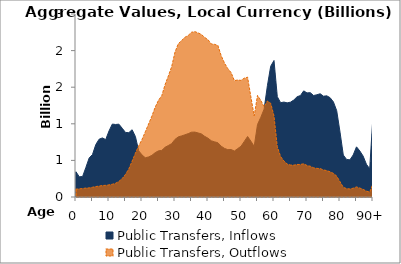
| Category | Public Transfers, Inflows | Public Transfers, Outflows |
|---|---|---|
| 0 | 343.75 | 106.53 |
|  | 275.985 | 111.307 |
| 2 | 280.15 | 115.499 |
| 3 | 404.807 | 122.504 |
| 4 | 533.809 | 124.625 |
| 5 | 580.75 | 133.541 |
| 6 | 716.269 | 142.572 |
| 7 | 789.448 | 149.073 |
| 8 | 807.11 | 156.905 |
| 9 | 784.408 | 159.259 |
| 10 | 901.787 | 165.523 |
| 11 | 996.02 | 173.846 |
| 12 | 990.498 | 187.168 |
| 13 | 994.981 | 212.823 |
| 14 | 939.573 | 251.793 |
| 15 | 881.979 | 309.012 |
| 16 | 878.866 | 382.616 |
| 17 | 918.712 | 489.172 |
| 18 | 826.902 | 597.548 |
| 19 | 630.935 | 699.611 |
| 20 | 574.482 | 785.461 |
| 21 | 536.081 | 890.348 |
| 22 | 547.18 | 997.469 |
| 23 | 569.436 | 1105.337 |
| 24 | 605.675 | 1226.828 |
| 25 | 630.66 | 1322.252 |
| 26 | 636.933 | 1385.184 |
| 27 | 679.573 | 1535.582 |
| 28 | 703.869 | 1655.488 |
| 29 | 729.202 | 1781.958 |
| 30 | 786.981 | 1979.469 |
| 31 | 821.622 | 2093.686 |
| 32 | 834.536 | 2137.818 |
| 33 | 849.674 | 2181.777 |
| 34 | 865.616 | 2206.667 |
| 35 | 885.205 | 2250.45 |
| 36 | 886.744 | 2259.616 |
| 37 | 874.959 | 2241.76 |
| 38 | 861.826 | 2220.67 |
| 39 | 828.774 | 2179.974 |
| 40 | 802.959 | 2148.683 |
| 41 | 767.996 | 2090.824 |
| 42 | 753.51 | 2085.432 |
| 43 | 741.053 | 2069.827 |
| 44 | 693.752 | 1930.207 |
| 45 | 664.023 | 1829.289 |
| 46 | 646.963 | 1754.611 |
| 47 | 648.277 | 1700.024 |
| 48 | 628.125 | 1589.107 |
| 49 | 661.247 | 1598.616 |
| 50 | 692.797 | 1592.995 |
| 51 | 759.493 | 1623.674 |
| 52 | 826.312 | 1637.286 |
| 53 | 762.04 | 1365.22 |
| 54 | 691.053 | 1107.94 |
| 55 | 989.937 | 1387.951 |
| 56 | 1088.853 | 1320.749 |
| 57 | 1199.983 | 1232.04 |
| 58 | 1520.38 | 1311.542 |
| 59 | 1786.443 | 1280.327 |
| 60 | 1864.814 | 1107.264 |
| 61 | 1370.644 | 686.723 |
| 62 | 1288.02 | 553.082 |
| 63 | 1296.875 | 492.382 |
| 64 | 1286.189 | 449.922 |
| 65 | 1295.817 | 437.205 |
| 66 | 1324.929 | 434.745 |
| 67 | 1369.922 | 444.316 |
| 68 | 1385.703 | 444.414 |
| 69 | 1450.12 | 453.346 |
| 70 | 1421.704 | 430.318 |
| 71 | 1425.418 | 419.914 |
| 72 | 1386.32 | 399.1 |
| 73 | 1396.704 | 390.959 |
| 74 | 1410.104 | 387.949 |
| 75 | 1377.205 | 369.729 |
| 76 | 1382.307 | 360.418 |
| 77 | 1356.719 | 344.045 |
| 78 | 1299.281 | 322.718 |
| 79 | 1179.584 | 284.94 |
| 80 | 887.633 | 209.064 |
| 81 | 572.944 | 131.75 |
| 82 | 512.899 | 114.537 |
| 83 | 507.932 | 109.625 |
| 84 | 574.185 | 119.812 |
| 85 | 685.364 | 138.101 |
| 86 | 629.202 | 122.173 |
| 87 | 559.408 | 104.51 |
| 88 | 447.966 | 80.349 |
| 89 | 385.491 | 66.291 |
| 90+ | 1111.672 | 183.137 |